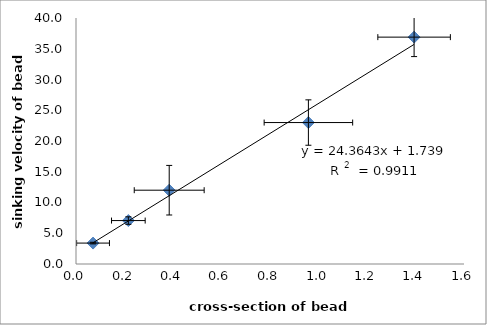
| Category | Series 0 |
|---|---|
| 0.0703008013697821 | 3.4 |
| 0.215876025606129 | 7.061 |
| 0.384345463505845 | 12 |
| 0.958359721792632 | 23 |
| 1.39423321153081 | 36.89 |